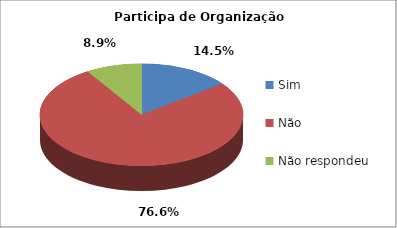
| Category | Series 0 |
|---|---|
| Sim | 18 |
| Não | 95 |
| Não respondeu | 11 |